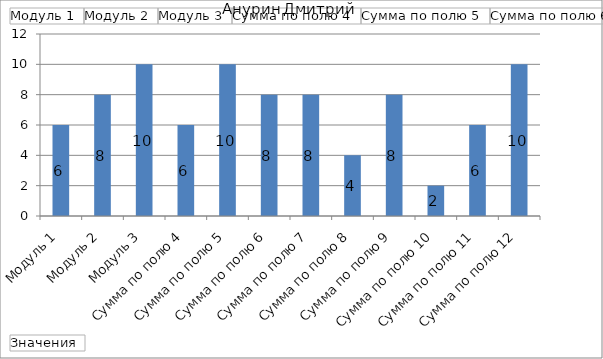
| Category | Итог |
|---|---|
| Модуль 1 | 6 |
| Модуль 2 | 8 |
| Модуль 3 | 10 |
| Сумма по полю 4 | 6 |
| Сумма по полю 5 | 10 |
| Сумма по полю 6 | 8 |
| Сумма по полю 7 | 8 |
| Сумма по полю 8 | 4 |
| Сумма по полю 9 | 8 |
| Сумма по полю 10 | 2 |
| Сумма по полю 11 | 6 |
| Сумма по полю 12 | 10 |